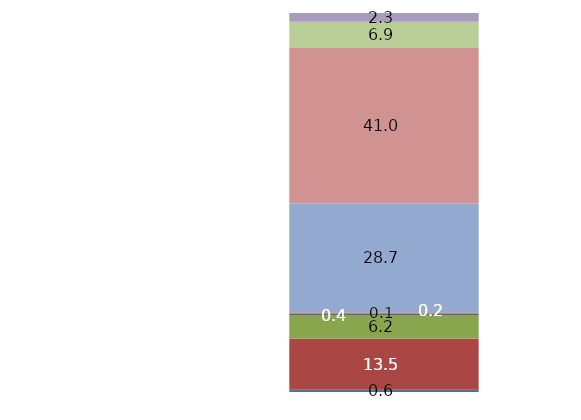
| Category |  BEBIDAS ESPIRITUOSAS  |  CERVEZA  | VINO | ESPUM (INC CAVA) | TINTO DE VERANO | SIDRA |  BEBIDAS REFRESCANTES  |  AGUA  |  ZUMO  |  BEB ZUMO+LECHE  |
|---|---|---|---|---|---|---|---|---|---|---|
| 0 | 0.591 | 13.47 | 6.232 | 0.447 | 0.092 | 0.215 | 28.74 | 40.988 | 6.909 | 2.317 |